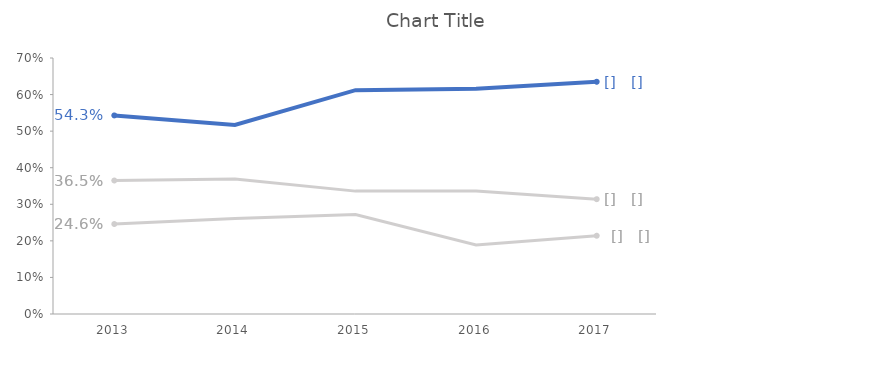
| Category | Sozialstatus niedrig | Sozialstatus mittel | Solzialstatus hoch |
|---|---|---|---|
| 2013.0 | 0.543 | 0.365 | 0.246 |
| 2014.0 | 0.517 | 0.369 | 0.261 |
| 2015.0 | 0.612 | 0.336 | 0.272 |
| 2016.0 | 0.616 | 0.336 | 0.189 |
| 2017.0 | 0.635 | 0.314 | 0.214 |